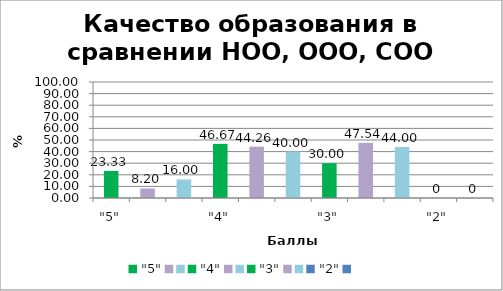
| Category | Качество образования в сравнении НОО, ООО, СОО % |
|---|---|
| "5" | 23.333 |
|  | 8.197 |
|  | 16 |
| "4" | 46.667 |
|  | 44.262 |
|  | 40 |
| "3" | 30 |
|  | 47.541 |
|  | 44 |
| "2" | 0 |